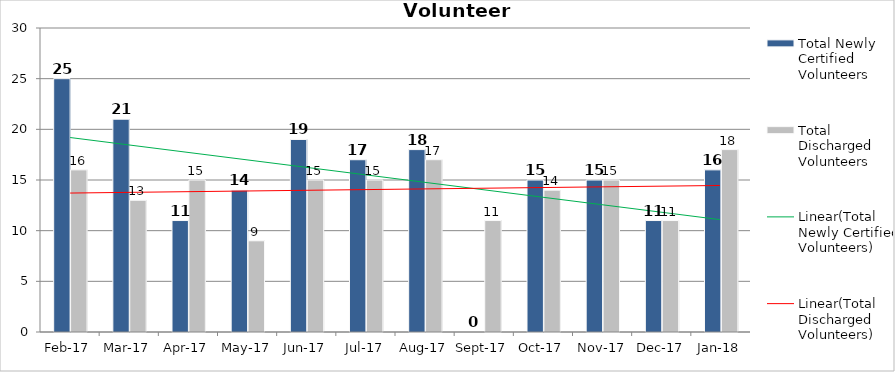
| Category | Total Newly Certified Volunteers | Total Discharged Volunteers |
|---|---|---|
| 2017-02-01 | 25 | 16 |
| 2017-03-01 | 21 | 13 |
| 2017-04-01 | 11 | 15 |
| 2017-05-01 | 14 | 9 |
| 2017-06-01 | 19 | 15 |
| 2017-07-01 | 17 | 15 |
| 2017-08-01 | 18 | 17 |
| 2017-09-01 | 0 | 11 |
| 2017-10-01 | 15 | 14 |
| 2017-11-01 | 15 | 15 |
| 2017-12-01 | 11 | 11 |
| 2018-01-01 | 16 | 18 |